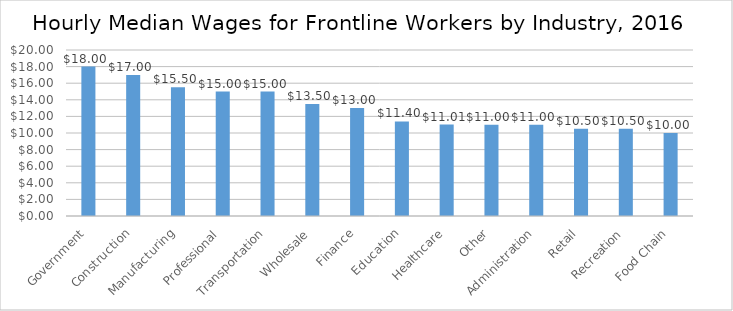
| Category | Series 0 |
|---|---|
| Government | 18 |
| Construction | 17 |
| Manufacturing | 15.5 |
| Professional | 15 |
| Transportation | 15 |
| Wholesale | 13.5 |
| Finance | 13 |
| Education | 11.4 |
| Healthcare | 11.01 |
| Other | 11 |
| Administration | 11 |
| Retail | 10.5 |
| Recreation | 10.5 |
| Food Chain | 10 |